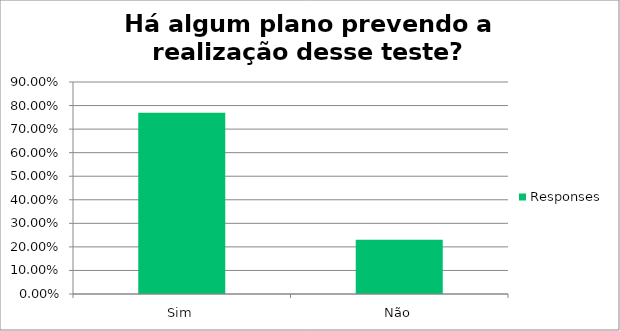
| Category | Responses |
|---|---|
| Sim | 0.769 |
| Não | 0.231 |